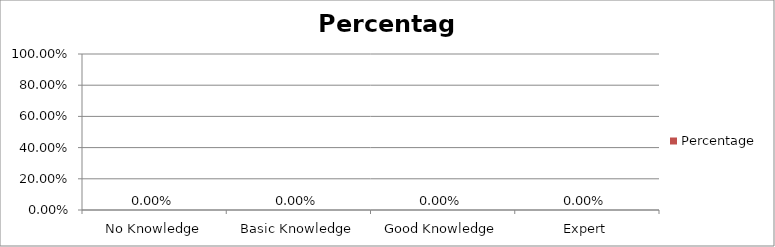
| Category | Percentage |
|---|---|
| No Knowledge | 0 |
| Basic Knowledge | 0 |
| Good Knowledge | 0 |
| Expert | 0 |